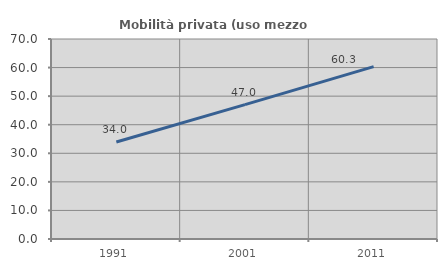
| Category | Mobilità privata (uso mezzo privato) |
|---|---|
| 1991.0 | 33.954 |
| 2001.0 | 47.045 |
| 2011.0 | 60.343 |